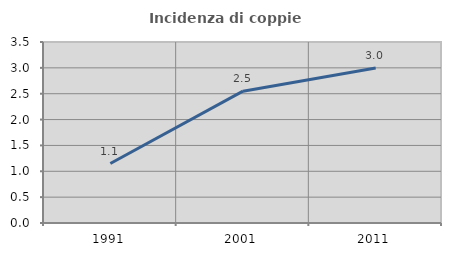
| Category | Incidenza di coppie miste |
|---|---|
| 1991.0 | 1.149 |
| 2001.0 | 2.55 |
| 2011.0 | 2.997 |